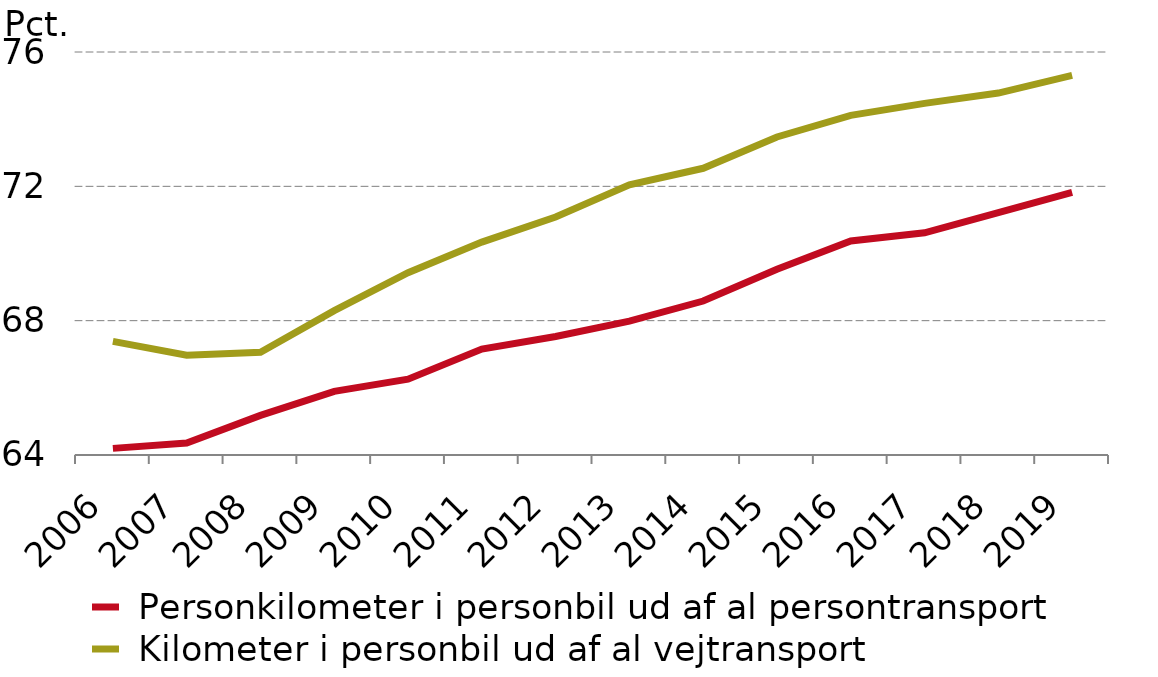
| Category |  Personkilometer i personbil ud af al persontransport |  Kilometer i personbil ud af al vejtransport  |
|---|---|---|
| 2006 | 64.197 | 67.383 |
| 2007 | 64.358 | 66.973 |
| 2008 | 65.18 | 67.058 |
| 2009 | 65.896 | 68.299 |
| 2010 | 66.256 | 69.427 |
| 2011 | 67.153 | 70.34 |
| 2012 | 67.53 | 71.088 |
| 2013 | 67.986 | 72.043 |
| 2014 | 68.585 | 72.537 |
| 2015 | 69.531 | 73.471 |
| 2016 | 70.372 | 74.114 |
| 2017 | 70.617 | 74.471 |
| 2018 | 71.219 | 74.777 |
| 2019 | 71.82 | 75.302 |